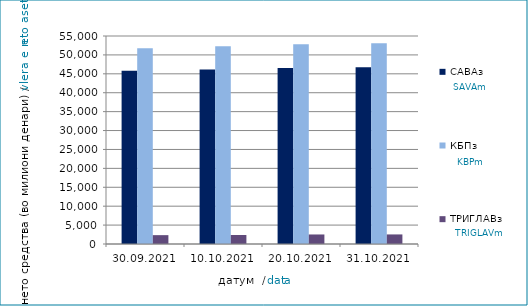
| Category | САВАз | КБПз | ТРИГЛАВз |
|---|---|---|---|
| 2021-09-30 | 45783.819 | 51775.787 | 2341.259 |
| 2021-10-10 | 46157.345 | 52257.802 | 2373.178 |
| 2021-10-20 | 46565.554 | 52845.366 | 2520.719 |
| 2021-10-31 | 46731.195 | 53068.205 | 2530.405 |